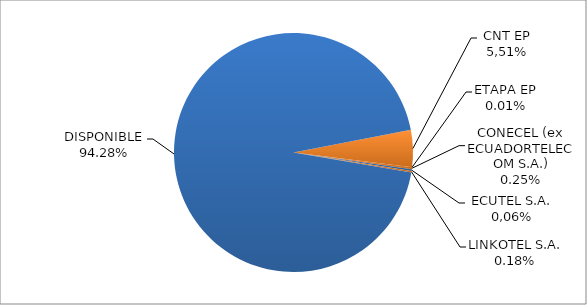
| Category | CODIGO DE AREA 5 |
|---|---|
| CORPORACIÓN NACIONAL TELECOMUNICACIONES CNT EP | 0.05 |
| ETAPA EP | 0 |
| CONECEL (ex ECUADORTELECOM S.A.) | 0.002 |
| SETEL S.A. | 0.003 |
| LINKOTEL S.A. | 0.002 |
| DISPONIBLE | 0.943 |